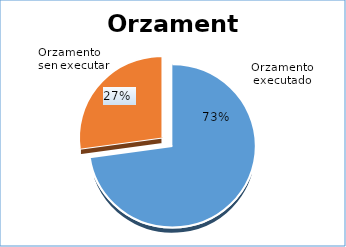
| Category | Series 0 |
|---|---|
| 0 | 216163.59 |
| 1 | 80776.41 |